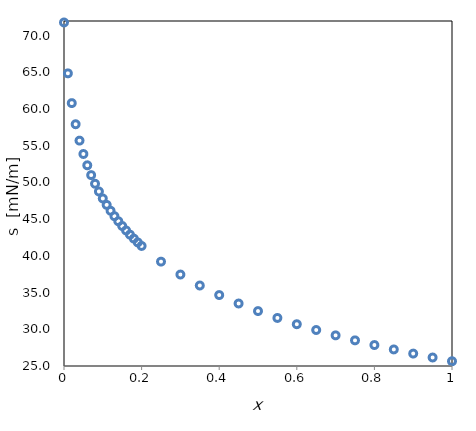
| Category | Tensión superficial - composición |
|---|---|
| 0.0 | 71.8 |
| 0.01 | 64.869 |
| 0.02 | 60.814 |
| 0.03 | 57.937 |
| 0.04 | 55.706 |
| 0.05 | 53.882 |
| 0.060000000000000005 | 52.341 |
| 0.07 | 51.006 |
| 0.08 | 49.828 |
| 0.09 | 48.774 |
| 0.09999999999999999 | 47.821 |
| 0.10999999999999999 | 46.951 |
| 0.11999999999999998 | 46.151 |
| 0.12999999999999998 | 45.409 |
| 0.13999999999999999 | 44.719 |
| 0.15 | 44.074 |
| 0.16 | 43.468 |
| 0.17 | 42.896 |
| 0.18000000000000002 | 42.356 |
| 0.19000000000000003 | 41.843 |
| 0.20000000000000004 | 41.355 |
| 0.25000000000000006 | 39.219 |
| 0.30000000000000004 | 37.46 |
| 0.35000000000000003 | 35.965 |
| 0.4 | 34.664 |
| 0.45 | 33.514 |
| 0.5 | 32.482 |
| 0.55 | 31.546 |
| 0.6000000000000001 | 30.691 |
| 0.6500000000000001 | 29.903 |
| 0.7000000000000002 | 29.173 |
| 0.7500000000000002 | 28.493 |
| 0.8000000000000003 | 27.856 |
| 0.8500000000000003 | 27.257 |
| 0.9000000000000004 | 26.691 |
| 0.9500000000000004 | 26.157 |
| 1.0000000000000004 | 25.649 |